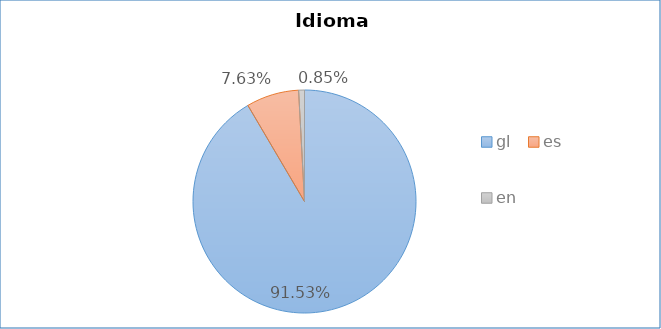
| Category | Idioma empregado |
|---|---|
| gl | 0.915 |
| es | 0.076 |
| en | 0.008 |